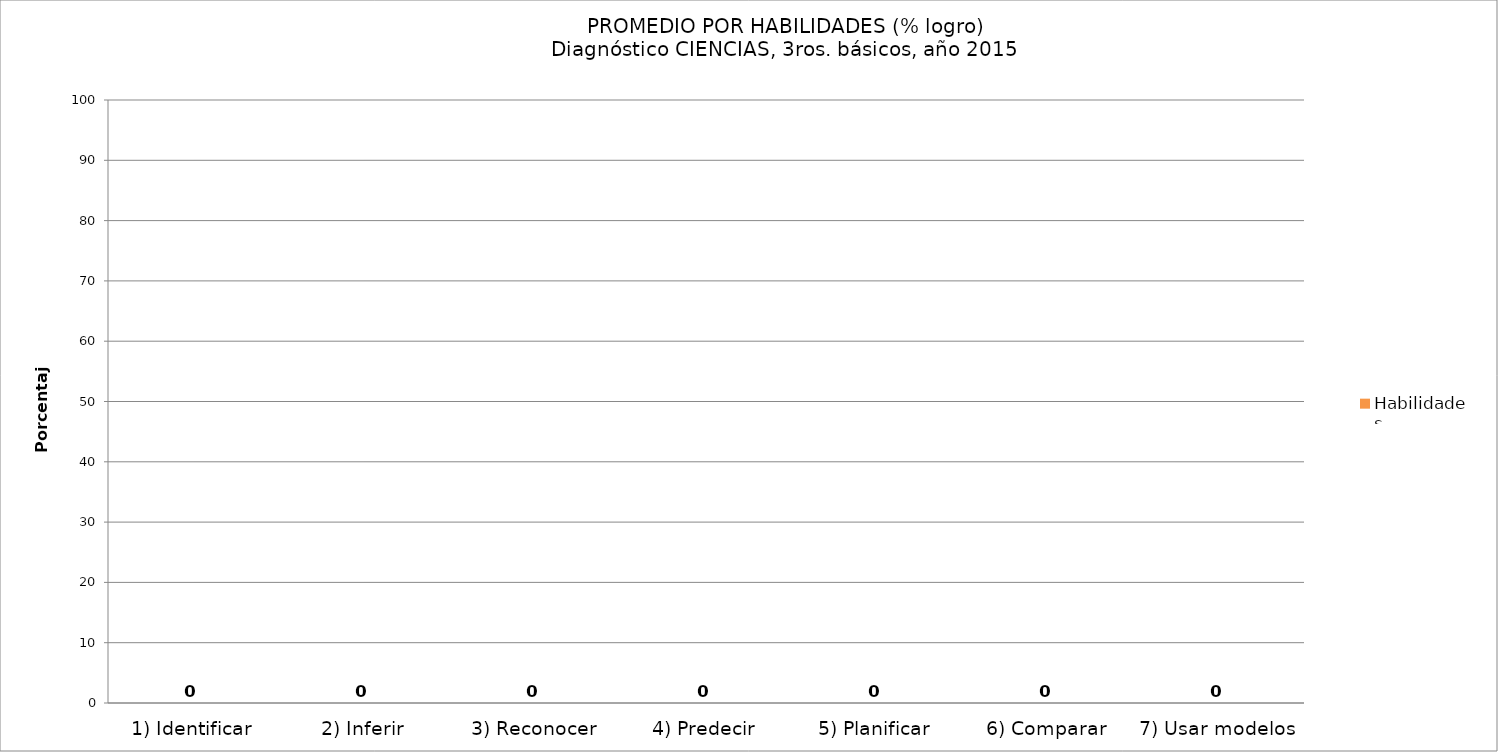
| Category | Habilidades |
|---|---|
| 1) Identificar | 0 |
| 2) Inferir | 0 |
| 3) Reconocer | 0 |
| 4) Predecir | 0 |
| 5) Planificar | 0 |
| 6) Comparar | 0 |
| 7) Usar modelos | 0 |